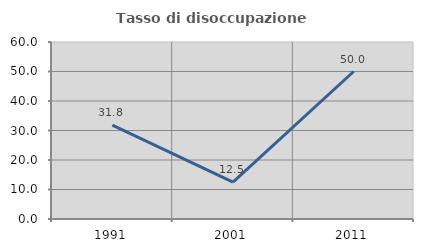
| Category | Tasso di disoccupazione giovanile  |
|---|---|
| 1991.0 | 31.818 |
| 2001.0 | 12.5 |
| 2011.0 | 50 |